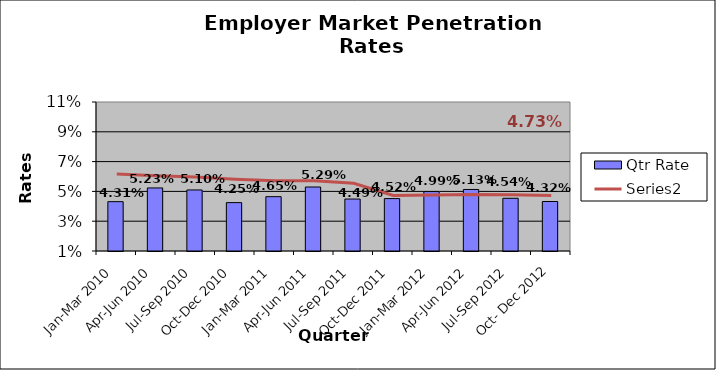
| Category | Qtr Rate |
|---|---|
| Jan-Mar 2010 | 0.043 |
| Apr-Jun 2010 | 0.052 |
| Jul-Sep 2010 | 0.051 |
| Oct-Dec 2010 | 0.042 |
| Jan-Mar 2011 | 0.046 |
| Apr-Jun 2011 | 0.053 |
| Jul-Sep 2011 | 0.045 |
| Oct-Dec 2011 | 0.045 |
| Jan-Mar 2012 | 0.05 |
| Apr-Jun 2012 | 0.051 |
| Jul-Sep 2012 | 0.045 |
| Oct- Dec 2012 | 0.043 |